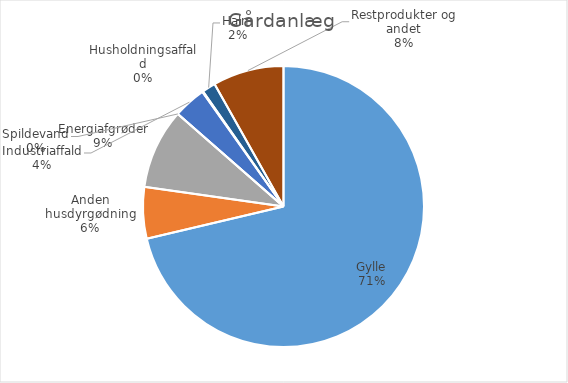
| Category | Series 0 |
|---|---|
| Gylle | 971802 |
| Anden husdyrgødning | 80720.6 |
| Energiafgrøder | 125460.1 |
| Spildevand | 0 |
| Industriaffald | 51081.13 |
| Husholdningsaffald | 1254 |
| Halm | 21088 |
| Restprodukter og andet | 111271.51 |